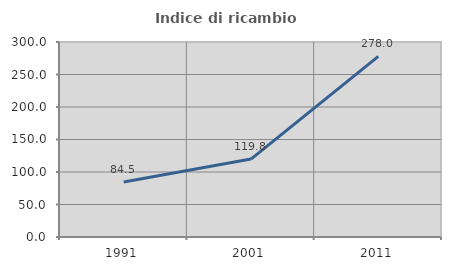
| Category | Indice di ricambio occupazionale  |
|---|---|
| 1991.0 | 84.479 |
| 2001.0 | 119.849 |
| 2011.0 | 277.953 |